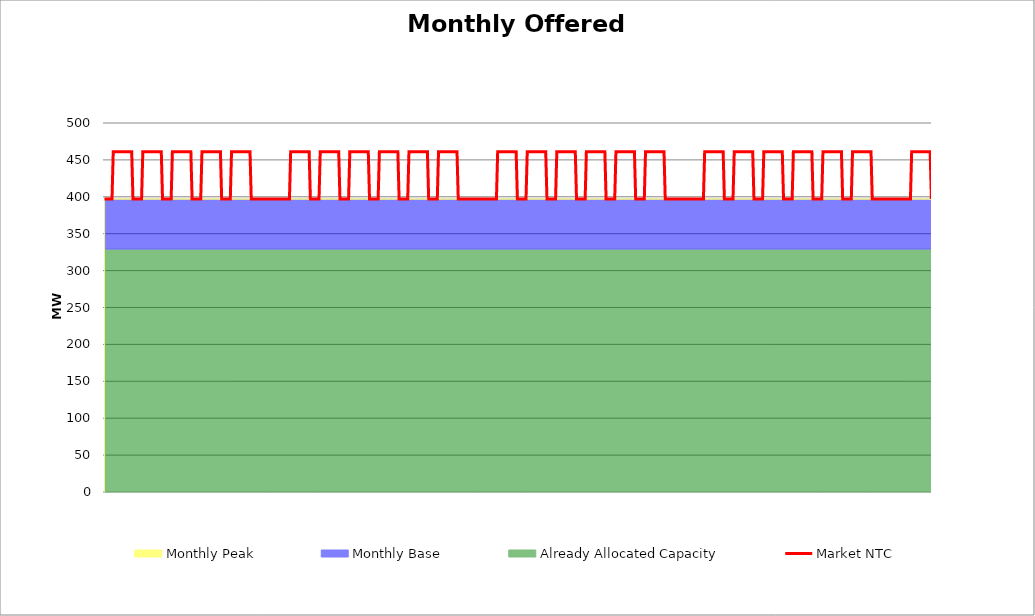
| Category | Market NTC |
|---|---|
| 0 | 397 |
| 1 | 397 |
| 2 | 397 |
| 3 | 397 |
| 4 | 397 |
| 5 | 397 |
| 6 | 397 |
| 7 | 461 |
| 8 | 461 |
| 9 | 461 |
| 10 | 461 |
| 11 | 461 |
| 12 | 461 |
| 13 | 461 |
| 14 | 461 |
| 15 | 461 |
| 16 | 461 |
| 17 | 461 |
| 18 | 461 |
| 19 | 461 |
| 20 | 461 |
| 21 | 461 |
| 22 | 461 |
| 23 | 397 |
| 24 | 397 |
| 25 | 397 |
| 26 | 397 |
| 27 | 397 |
| 28 | 397 |
| 29 | 397 |
| 30 | 397 |
| 31 | 461 |
| 32 | 461 |
| 33 | 461 |
| 34 | 461 |
| 35 | 461 |
| 36 | 461 |
| 37 | 461 |
| 38 | 461 |
| 39 | 461 |
| 40 | 461 |
| 41 | 461 |
| 42 | 461 |
| 43 | 461 |
| 44 | 461 |
| 45 | 461 |
| 46 | 461 |
| 47 | 397 |
| 48 | 397 |
| 49 | 397 |
| 50 | 397 |
| 51 | 397 |
| 52 | 397 |
| 53 | 397 |
| 54 | 397 |
| 55 | 461 |
| 56 | 461 |
| 57 | 461 |
| 58 | 461 |
| 59 | 461 |
| 60 | 461 |
| 61 | 461 |
| 62 | 461 |
| 63 | 461 |
| 64 | 461 |
| 65 | 461 |
| 66 | 461 |
| 67 | 461 |
| 68 | 461 |
| 69 | 461 |
| 70 | 461 |
| 71 | 397 |
| 72 | 397 |
| 73 | 397 |
| 74 | 397 |
| 75 | 397 |
| 76 | 397 |
| 77 | 397 |
| 78 | 397 |
| 79 | 461 |
| 80 | 461 |
| 81 | 461 |
| 82 | 461 |
| 83 | 461 |
| 84 | 461 |
| 85 | 461 |
| 86 | 461 |
| 87 | 461 |
| 88 | 461 |
| 89 | 461 |
| 90 | 461 |
| 91 | 461 |
| 92 | 461 |
| 93 | 461 |
| 94 | 461 |
| 95 | 397 |
| 96 | 397 |
| 97 | 397 |
| 98 | 397 |
| 99 | 397 |
| 100 | 397 |
| 101 | 397 |
| 102 | 397 |
| 103 | 461 |
| 104 | 461 |
| 105 | 461 |
| 106 | 461 |
| 107 | 461 |
| 108 | 461 |
| 109 | 461 |
| 110 | 461 |
| 111 | 461 |
| 112 | 461 |
| 113 | 461 |
| 114 | 461 |
| 115 | 461 |
| 116 | 461 |
| 117 | 461 |
| 118 | 461 |
| 119 | 397 |
| 120 | 397 |
| 121 | 397 |
| 122 | 397 |
| 123 | 397 |
| 124 | 397 |
| 125 | 397 |
| 126 | 397 |
| 127 | 397 |
| 128 | 397 |
| 129 | 397 |
| 130 | 397 |
| 131 | 397 |
| 132 | 397 |
| 133 | 397 |
| 134 | 397 |
| 135 | 397 |
| 136 | 397 |
| 137 | 397 |
| 138 | 397 |
| 139 | 397 |
| 140 | 397 |
| 141 | 397 |
| 142 | 397 |
| 143 | 397 |
| 144 | 397 |
| 145 | 397 |
| 146 | 397 |
| 147 | 397 |
| 148 | 397 |
| 149 | 397 |
| 150 | 397 |
| 151 | 461 |
| 152 | 461 |
| 153 | 461 |
| 154 | 461 |
| 155 | 461 |
| 156 | 461 |
| 157 | 461 |
| 158 | 461 |
| 159 | 461 |
| 160 | 461 |
| 161 | 461 |
| 162 | 461 |
| 163 | 461 |
| 164 | 461 |
| 165 | 461 |
| 166 | 461 |
| 167 | 397 |
| 168 | 397 |
| 169 | 397 |
| 170 | 397 |
| 171 | 397 |
| 172 | 397 |
| 173 | 397 |
| 174 | 397 |
| 175 | 461 |
| 176 | 461 |
| 177 | 461 |
| 178 | 461 |
| 179 | 461 |
| 180 | 461 |
| 181 | 461 |
| 182 | 461 |
| 183 | 461 |
| 184 | 461 |
| 185 | 461 |
| 186 | 461 |
| 187 | 461 |
| 188 | 461 |
| 189 | 461 |
| 190 | 461 |
| 191 | 397 |
| 192 | 397 |
| 193 | 397 |
| 194 | 397 |
| 195 | 397 |
| 196 | 397 |
| 197 | 397 |
| 198 | 397 |
| 199 | 461 |
| 200 | 461 |
| 201 | 461 |
| 202 | 461 |
| 203 | 461 |
| 204 | 461 |
| 205 | 461 |
| 206 | 461 |
| 207 | 461 |
| 208 | 461 |
| 209 | 461 |
| 210 | 461 |
| 211 | 461 |
| 212 | 461 |
| 213 | 461 |
| 214 | 461 |
| 215 | 397 |
| 216 | 397 |
| 217 | 397 |
| 218 | 397 |
| 219 | 397 |
| 220 | 397 |
| 221 | 397 |
| 222 | 397 |
| 223 | 461 |
| 224 | 461 |
| 225 | 461 |
| 226 | 461 |
| 227 | 461 |
| 228 | 461 |
| 229 | 461 |
| 230 | 461 |
| 231 | 461 |
| 232 | 461 |
| 233 | 461 |
| 234 | 461 |
| 235 | 461 |
| 236 | 461 |
| 237 | 461 |
| 238 | 461 |
| 239 | 397 |
| 240 | 397 |
| 241 | 397 |
| 242 | 397 |
| 243 | 397 |
| 244 | 397 |
| 245 | 397 |
| 246 | 397 |
| 247 | 461 |
| 248 | 461 |
| 249 | 461 |
| 250 | 461 |
| 251 | 461 |
| 252 | 461 |
| 253 | 461 |
| 254 | 461 |
| 255 | 461 |
| 256 | 461 |
| 257 | 461 |
| 258 | 461 |
| 259 | 461 |
| 260 | 461 |
| 261 | 461 |
| 262 | 461 |
| 263 | 397 |
| 264 | 397 |
| 265 | 397 |
| 266 | 397 |
| 267 | 397 |
| 268 | 397 |
| 269 | 397 |
| 270 | 397 |
| 271 | 461 |
| 272 | 461 |
| 273 | 461 |
| 274 | 461 |
| 275 | 461 |
| 276 | 461 |
| 277 | 461 |
| 278 | 461 |
| 279 | 461 |
| 280 | 461 |
| 281 | 461 |
| 282 | 461 |
| 283 | 461 |
| 284 | 461 |
| 285 | 461 |
| 286 | 461 |
| 287 | 397 |
| 288 | 397 |
| 289 | 397 |
| 290 | 397 |
| 291 | 397 |
| 292 | 397 |
| 293 | 397 |
| 294 | 397 |
| 295 | 397 |
| 296 | 397 |
| 297 | 397 |
| 298 | 397 |
| 299 | 397 |
| 300 | 397 |
| 301 | 397 |
| 302 | 397 |
| 303 | 397 |
| 304 | 397 |
| 305 | 397 |
| 306 | 397 |
| 307 | 397 |
| 308 | 397 |
| 309 | 397 |
| 310 | 397 |
| 311 | 397 |
| 312 | 397 |
| 313 | 397 |
| 314 | 397 |
| 315 | 397 |
| 316 | 397 |
| 317 | 397 |
| 318 | 397 |
| 319 | 461 |
| 320 | 461 |
| 321 | 461 |
| 322 | 461 |
| 323 | 461 |
| 324 | 461 |
| 325 | 461 |
| 326 | 461 |
| 327 | 461 |
| 328 | 461 |
| 329 | 461 |
| 330 | 461 |
| 331 | 461 |
| 332 | 461 |
| 333 | 461 |
| 334 | 461 |
| 335 | 397 |
| 336 | 397 |
| 337 | 397 |
| 338 | 397 |
| 339 | 397 |
| 340 | 397 |
| 341 | 397 |
| 342 | 397 |
| 343 | 461 |
| 344 | 461 |
| 345 | 461 |
| 346 | 461 |
| 347 | 461 |
| 348 | 461 |
| 349 | 461 |
| 350 | 461 |
| 351 | 461 |
| 352 | 461 |
| 353 | 461 |
| 354 | 461 |
| 355 | 461 |
| 356 | 461 |
| 357 | 461 |
| 358 | 461 |
| 359 | 397 |
| 360 | 397 |
| 361 | 397 |
| 362 | 397 |
| 363 | 397 |
| 364 | 397 |
| 365 | 397 |
| 366 | 397 |
| 367 | 461 |
| 368 | 461 |
| 369 | 461 |
| 370 | 461 |
| 371 | 461 |
| 372 | 461 |
| 373 | 461 |
| 374 | 461 |
| 375 | 461 |
| 376 | 461 |
| 377 | 461 |
| 378 | 461 |
| 379 | 461 |
| 380 | 461 |
| 381 | 461 |
| 382 | 461 |
| 383 | 397 |
| 384 | 397 |
| 385 | 397 |
| 386 | 397 |
| 387 | 397 |
| 388 | 397 |
| 389 | 397 |
| 390 | 397 |
| 391 | 461 |
| 392 | 461 |
| 393 | 461 |
| 394 | 461 |
| 395 | 461 |
| 396 | 461 |
| 397 | 461 |
| 398 | 461 |
| 399 | 461 |
| 400 | 461 |
| 401 | 461 |
| 402 | 461 |
| 403 | 461 |
| 404 | 461 |
| 405 | 461 |
| 406 | 461 |
| 407 | 397 |
| 408 | 397 |
| 409 | 397 |
| 410 | 397 |
| 411 | 397 |
| 412 | 397 |
| 413 | 397 |
| 414 | 397 |
| 415 | 461 |
| 416 | 461 |
| 417 | 461 |
| 418 | 461 |
| 419 | 461 |
| 420 | 461 |
| 421 | 461 |
| 422 | 461 |
| 423 | 461 |
| 424 | 461 |
| 425 | 461 |
| 426 | 461 |
| 427 | 461 |
| 428 | 461 |
| 429 | 461 |
| 430 | 461 |
| 431 | 397 |
| 432 | 397 |
| 433 | 397 |
| 434 | 397 |
| 435 | 397 |
| 436 | 397 |
| 437 | 397 |
| 438 | 397 |
| 439 | 461 |
| 440 | 461 |
| 441 | 461 |
| 442 | 461 |
| 443 | 461 |
| 444 | 461 |
| 445 | 461 |
| 446 | 461 |
| 447 | 461 |
| 448 | 461 |
| 449 | 461 |
| 450 | 461 |
| 451 | 461 |
| 452 | 461 |
| 453 | 461 |
| 454 | 461 |
| 455 | 397 |
| 456 | 397 |
| 457 | 397 |
| 458 | 397 |
| 459 | 397 |
| 460 | 397 |
| 461 | 397 |
| 462 | 397 |
| 463 | 397 |
| 464 | 397 |
| 465 | 397 |
| 466 | 397 |
| 467 | 397 |
| 468 | 397 |
| 469 | 397 |
| 470 | 397 |
| 471 | 397 |
| 472 | 397 |
| 473 | 397 |
| 474 | 397 |
| 475 | 397 |
| 476 | 397 |
| 477 | 397 |
| 478 | 397 |
| 479 | 397 |
| 480 | 397 |
| 481 | 397 |
| 482 | 397 |
| 483 | 397 |
| 484 | 397 |
| 485 | 397 |
| 486 | 397 |
| 487 | 461 |
| 488 | 461 |
| 489 | 461 |
| 490 | 461 |
| 491 | 461 |
| 492 | 461 |
| 493 | 461 |
| 494 | 461 |
| 495 | 461 |
| 496 | 461 |
| 497 | 461 |
| 498 | 461 |
| 499 | 461 |
| 500 | 461 |
| 501 | 461 |
| 502 | 461 |
| 503 | 397 |
| 504 | 397 |
| 505 | 397 |
| 506 | 397 |
| 507 | 397 |
| 508 | 397 |
| 509 | 397 |
| 510 | 397 |
| 511 | 461 |
| 512 | 461 |
| 513 | 461 |
| 514 | 461 |
| 515 | 461 |
| 516 | 461 |
| 517 | 461 |
| 518 | 461 |
| 519 | 461 |
| 520 | 461 |
| 521 | 461 |
| 522 | 461 |
| 523 | 461 |
| 524 | 461 |
| 525 | 461 |
| 526 | 461 |
| 527 | 397 |
| 528 | 397 |
| 529 | 397 |
| 530 | 397 |
| 531 | 397 |
| 532 | 397 |
| 533 | 397 |
| 534 | 397 |
| 535 | 461 |
| 536 | 461 |
| 537 | 461 |
| 538 | 461 |
| 539 | 461 |
| 540 | 461 |
| 541 | 461 |
| 542 | 461 |
| 543 | 461 |
| 544 | 461 |
| 545 | 461 |
| 546 | 461 |
| 547 | 461 |
| 548 | 461 |
| 549 | 461 |
| 550 | 461 |
| 551 | 397 |
| 552 | 397 |
| 553 | 397 |
| 554 | 397 |
| 555 | 397 |
| 556 | 397 |
| 557 | 397 |
| 558 | 397 |
| 559 | 461 |
| 560 | 461 |
| 561 | 461 |
| 562 | 461 |
| 563 | 461 |
| 564 | 461 |
| 565 | 461 |
| 566 | 461 |
| 567 | 461 |
| 568 | 461 |
| 569 | 461 |
| 570 | 461 |
| 571 | 461 |
| 572 | 461 |
| 573 | 461 |
| 574 | 461 |
| 575 | 397 |
| 576 | 397 |
| 577 | 397 |
| 578 | 397 |
| 579 | 397 |
| 580 | 397 |
| 581 | 397 |
| 582 | 397 |
| 583 | 461 |
| 584 | 461 |
| 585 | 461 |
| 586 | 461 |
| 587 | 461 |
| 588 | 461 |
| 589 | 461 |
| 590 | 461 |
| 591 | 461 |
| 592 | 461 |
| 593 | 461 |
| 594 | 461 |
| 595 | 461 |
| 596 | 461 |
| 597 | 461 |
| 598 | 461 |
| 599 | 397 |
| 600 | 397 |
| 601 | 397 |
| 602 | 397 |
| 603 | 397 |
| 604 | 397 |
| 605 | 397 |
| 606 | 397 |
| 607 | 461 |
| 608 | 461 |
| 609 | 461 |
| 610 | 461 |
| 611 | 461 |
| 612 | 461 |
| 613 | 461 |
| 614 | 461 |
| 615 | 461 |
| 616 | 461 |
| 617 | 461 |
| 618 | 461 |
| 619 | 461 |
| 620 | 461 |
| 621 | 461 |
| 622 | 461 |
| 623 | 397 |
| 624 | 397 |
| 625 | 397 |
| 626 | 397 |
| 627 | 397 |
| 628 | 397 |
| 629 | 397 |
| 630 | 397 |
| 631 | 397 |
| 632 | 397 |
| 633 | 397 |
| 634 | 397 |
| 635 | 397 |
| 636 | 397 |
| 637 | 397 |
| 638 | 397 |
| 639 | 397 |
| 640 | 397 |
| 641 | 397 |
| 642 | 397 |
| 643 | 397 |
| 644 | 397 |
| 645 | 397 |
| 646 | 397 |
| 647 | 397 |
| 648 | 397 |
| 649 | 397 |
| 650 | 397 |
| 651 | 397 |
| 652 | 397 |
| 653 | 397 |
| 654 | 397 |
| 655 | 461 |
| 656 | 461 |
| 657 | 461 |
| 658 | 461 |
| 659 | 461 |
| 660 | 461 |
| 661 | 461 |
| 662 | 461 |
| 663 | 461 |
| 664 | 461 |
| 665 | 461 |
| 666 | 461 |
| 667 | 461 |
| 668 | 461 |
| 669 | 461 |
| 670 | 461 |
| 671 | 397 |